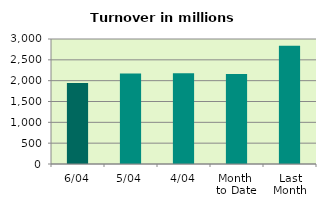
| Category | Series 0 |
|---|---|
| 6/04 | 1942.397 |
| 5/04 | 2170.67 |
| 4/04 | 2179.096 |
| Month 
to Date | 2158.408 |
| Last
Month | 2840.905 |